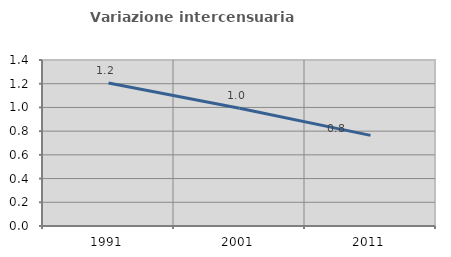
| Category | Variazione intercensuaria annua |
|---|---|
| 1991.0 | 1.206 |
| 2001.0 | 0.993 |
| 2011.0 | 0.764 |